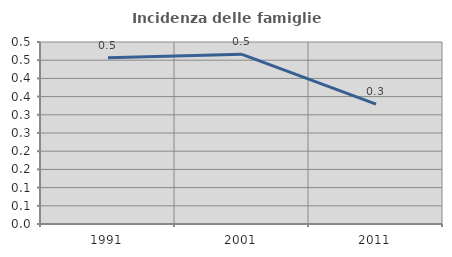
| Category | Incidenza delle famiglie numerose |
|---|---|
| 1991.0 | 0.457 |
| 2001.0 | 0.466 |
| 2011.0 | 0.329 |